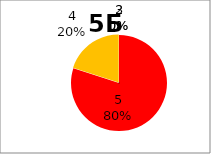
| Category | Series 0 |
|---|---|
| 5.0 | 8 |
| 4.0 | 2 |
| 3.0 | 0 |
| 2.0 | 0 |